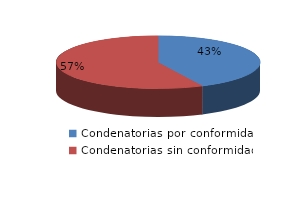
| Category | Series 0 |
|---|---|
| 0 | 21 |
| 1 | 28 |